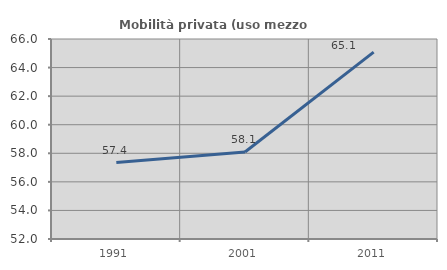
| Category | Mobilità privata (uso mezzo privato) |
|---|---|
| 1991.0 | 57.352 |
| 2001.0 | 58.093 |
| 2011.0 | 65.084 |